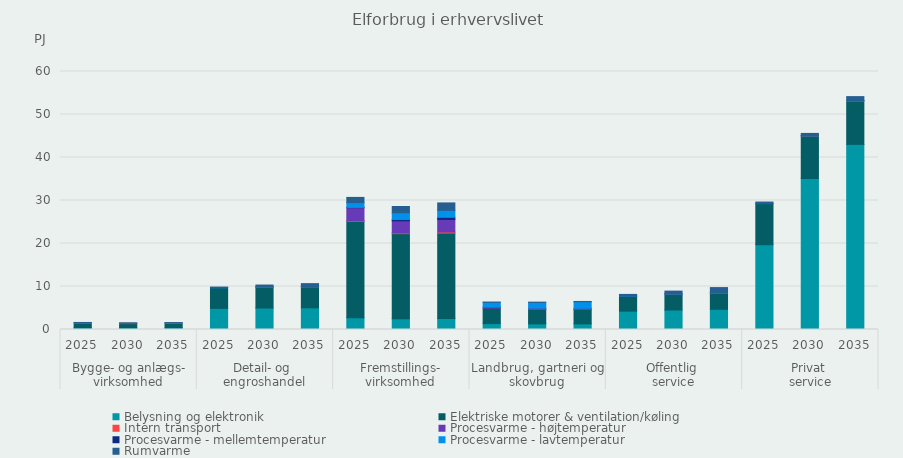
| Category | Belysning og elektronik | Elektriske motorer & ventilation/køling | Intern transport | Procesvarme - højtemperatur | Procesvarme - mellemtemperatur | Procesvarme - lavtemperatur | Rumvarme |
|---|---|---|---|---|---|---|---|
| 0 | 0.4 | 1.09 | 0.06 | 0 | 0 | 0 | 0.09 |
| 1 | 0.37 | 1 | 0.08 | 0 | 0 | 0 | 0.11 |
| 2 | 0.38 | 1.01 | 0.11 | 0 | 0 | 0 | 0.12 |
| 3 | 4.91 | 4.81 | 0 | 0 | 0 | 0.01 | 0.14 |
| 4 | 4.99 | 4.87 | 0.01 | 0 | 0 | 0.02 | 0.45 |
| 5 | 5.04 | 4.89 | 0.02 | 0 | 0 | 0.04 | 0.68 |
| 6 | 2.74 | 22.38 | 0.15 | 3.06 | 0.06 | 1.12 | 1.21 |
| 7 | 2.52 | 19.77 | 0.17 | 2.81 | 0.32 | 1.56 | 1.46 |
| 8 | 2.58 | 19.83 | 0.27 | 2.91 | 0.5 | 1.63 | 1.72 |
| 9 | 1.37 | 3.6 | 0 | 0.29 | 0 | 1.07 | 0.03 |
| 10 | 1.31 | 3.39 | 0.01 | 0.27 | 0 | 1.32 | 0.05 |
| 11 | 1.31 | 3.37 | 0.01 | 0.26 | 0 | 1.51 | 0.06 |
| 12 | 4.27 | 3.48 | 0 | 0 | 0 | 0.01 | 0.4 |
| 13 | 4.54 | 3.68 | 0.01 | 0 | 0 | 0.01 | 0.69 |
| 14 | 4.69 | 3.78 | 0.01 | 0 | 0 | 0.01 | 1.26 |
| 15 | 19.72 | 9.56 | 0 | 0 | 0 | 0.01 | 0.35 |
| 16 | 35.12 | 9.9 | 0.01 | 0 | 0 | 0.03 | 0.54 |
| 17 | 43.05 | 10.12 | 0.02 | 0 | 0 | 0.05 | 0.92 |